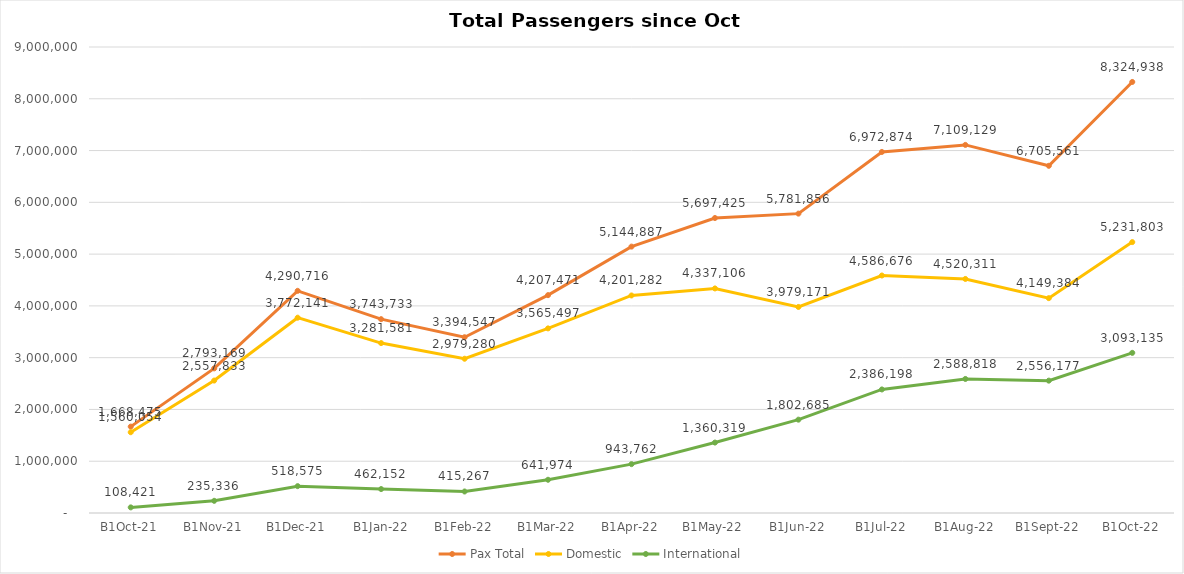
| Category | Pax Total |  Domestic  |  International  |
|---|---|---|---|
| 2021-10-01 | 1668475 | 1560054 | 108421 |
| 2021-11-01 | 2793169 | 2557833 | 235336 |
| 2021-12-01 | 4290716 | 3772141 | 518575 |
| 2022-01-01 | 3743733 | 3281581 | 462152 |
| 2022-02-01 | 3394547 | 2979280 | 415267 |
| 2022-03-01 | 4207471 | 3565497 | 641974 |
| 2022-04-01 | 5144887 | 4201282 | 943762 |
| 2022-05-01 | 5697425 | 4337106 | 1360319 |
| 2022-06-01 | 5781856 | 3979171 | 1802685 |
| 2022-07-01 | 6972874 | 4586676 | 2386198 |
| 2022-08-01 | 7109129 | 4520311 | 2588818 |
| 2022-09-01 | 6705561 | 4149384 | 2556177 |
| 2022-10-01 | 8324938 | 5231803 | 3093135 |